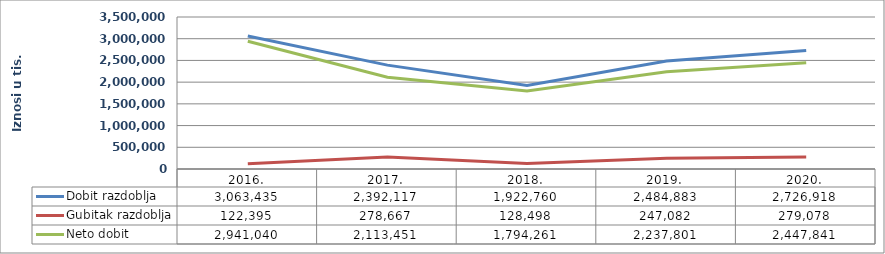
| Category | Dobit razdoblja  | Gubitak razdoblja  | Neto dobit |
|---|---|---|---|
| 2016. | 3063434.578 | 122394.612 | 2941039.966 |
| 2017. | 2392117.433 | 278666.714 | 2113450.719 |
| 2018. | 1922759.722 | 128498.477 | 1794261.245 |
| 2019. | 2484882.825 | 247081.882 | 2237800.943 |
| 2020. | 2726918.288 | 279077.511 | 2447840.777 |